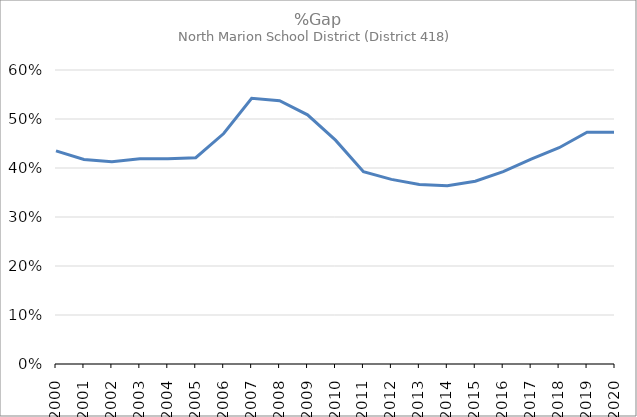
| Category | Series 0 |
|---|---|
| 2000.0 | 0.435 |
| 2001.0 | 0.418 |
| 2002.0 | 0.413 |
| 2003.0 | 0.419 |
| 2004.0 | 0.419 |
| 2005.0 | 0.421 |
| 2006.0 | 0.47 |
| 2007.0 | 0.542 |
| 2008.0 | 0.537 |
| 2009.0 | 0.508 |
| 2010.0 | 0.457 |
| 2011.0 | 0.392 |
| 2012.0 | 0.377 |
| 2013.0 | 0.367 |
| 2014.0 | 0.364 |
| 2015.0 | 0.373 |
| 2016.0 | 0.393 |
| 2017.0 | 0.418 |
| 2018.0 | 0.441 |
| 2019.0 | 0.473 |
| 2020.0 | 0.473 |